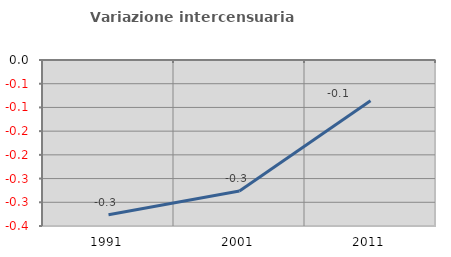
| Category | Variazione intercensuaria annua |
|---|---|
| 1991.0 | -0.326 |
| 2001.0 | -0.276 |
| 2011.0 | -0.086 |